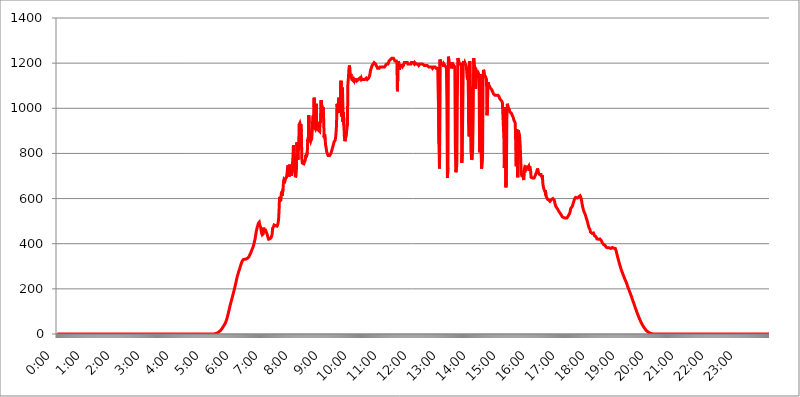
| Category | 2015.04.24. Intenzitás [W/m^2] |
|---|---|
| 0.0 | -0.256 |
| 0.0006944444444444445 | -0.256 |
| 0.001388888888888889 | -0.256 |
| 0.0020833333333333333 | -0.256 |
| 0.002777777777777778 | -0.256 |
| 0.003472222222222222 | -0.256 |
| 0.004166666666666667 | -0.256 |
| 0.004861111111111111 | -0.256 |
| 0.005555555555555556 | -0.256 |
| 0.0062499999999999995 | -0.256 |
| 0.006944444444444444 | -0.256 |
| 0.007638888888888889 | -0.256 |
| 0.008333333333333333 | -0.256 |
| 0.009027777777777779 | -0.256 |
| 0.009722222222222222 | -0.256 |
| 0.010416666666666666 | -0.256 |
| 0.011111111111111112 | -0.256 |
| 0.011805555555555555 | -0.256 |
| 0.012499999999999999 | -0.256 |
| 0.013194444444444444 | -0.256 |
| 0.013888888888888888 | -0.256 |
| 0.014583333333333332 | -0.256 |
| 0.015277777777777777 | -0.256 |
| 0.015972222222222224 | -0.256 |
| 0.016666666666666666 | -0.256 |
| 0.017361111111111112 | -0.256 |
| 0.018055555555555557 | -0.256 |
| 0.01875 | -0.256 |
| 0.019444444444444445 | -0.256 |
| 0.02013888888888889 | -0.256 |
| 0.020833333333333332 | -0.256 |
| 0.02152777777777778 | -0.256 |
| 0.022222222222222223 | -0.256 |
| 0.02291666666666667 | -0.256 |
| 0.02361111111111111 | -0.256 |
| 0.024305555555555556 | -0.256 |
| 0.024999999999999998 | -0.256 |
| 0.025694444444444447 | -0.256 |
| 0.02638888888888889 | -0.256 |
| 0.027083333333333334 | -0.256 |
| 0.027777777777777776 | -0.256 |
| 0.02847222222222222 | -0.256 |
| 0.029166666666666664 | -0.256 |
| 0.029861111111111113 | -0.256 |
| 0.030555555555555555 | -0.256 |
| 0.03125 | -0.256 |
| 0.03194444444444445 | -0.256 |
| 0.03263888888888889 | -0.256 |
| 0.03333333333333333 | -0.256 |
| 0.034027777777777775 | -0.256 |
| 0.034722222222222224 | -0.256 |
| 0.035416666666666666 | -0.256 |
| 0.036111111111111115 | -0.256 |
| 0.03680555555555556 | -0.256 |
| 0.0375 | -0.256 |
| 0.03819444444444444 | -0.256 |
| 0.03888888888888889 | -0.256 |
| 0.03958333333333333 | -0.256 |
| 0.04027777777777778 | -0.256 |
| 0.04097222222222222 | -0.256 |
| 0.041666666666666664 | -0.256 |
| 0.042361111111111106 | -0.256 |
| 0.04305555555555556 | -0.256 |
| 0.043750000000000004 | -0.256 |
| 0.044444444444444446 | -0.256 |
| 0.04513888888888889 | -0.256 |
| 0.04583333333333334 | -0.256 |
| 0.04652777777777778 | -0.256 |
| 0.04722222222222222 | -0.256 |
| 0.04791666666666666 | -0.256 |
| 0.04861111111111111 | -0.256 |
| 0.049305555555555554 | -0.256 |
| 0.049999999999999996 | -0.256 |
| 0.05069444444444445 | -0.256 |
| 0.051388888888888894 | -0.256 |
| 0.052083333333333336 | -0.256 |
| 0.05277777777777778 | -0.256 |
| 0.05347222222222222 | -0.256 |
| 0.05416666666666667 | -0.256 |
| 0.05486111111111111 | -0.256 |
| 0.05555555555555555 | -0.256 |
| 0.05625 | -0.256 |
| 0.05694444444444444 | -0.256 |
| 0.057638888888888885 | -0.256 |
| 0.05833333333333333 | -0.256 |
| 0.05902777777777778 | -0.256 |
| 0.059722222222222225 | -0.256 |
| 0.06041666666666667 | -0.256 |
| 0.061111111111111116 | -0.256 |
| 0.06180555555555556 | -0.256 |
| 0.0625 | -0.256 |
| 0.06319444444444444 | -0.256 |
| 0.06388888888888888 | -0.256 |
| 0.06458333333333334 | -0.256 |
| 0.06527777777777778 | -0.256 |
| 0.06597222222222222 | -0.256 |
| 0.06666666666666667 | -0.256 |
| 0.06736111111111111 | -0.256 |
| 0.06805555555555555 | -0.256 |
| 0.06874999999999999 | -0.256 |
| 0.06944444444444443 | -0.256 |
| 0.07013888888888889 | -0.256 |
| 0.07083333333333333 | -0.256 |
| 0.07152777777777779 | -0.256 |
| 0.07222222222222223 | -0.256 |
| 0.07291666666666667 | -0.256 |
| 0.07361111111111111 | -0.256 |
| 0.07430555555555556 | -0.256 |
| 0.075 | -0.256 |
| 0.07569444444444444 | -0.256 |
| 0.0763888888888889 | -0.256 |
| 0.07708333333333334 | -0.256 |
| 0.07777777777777778 | -0.256 |
| 0.07847222222222222 | -0.256 |
| 0.07916666666666666 | -0.256 |
| 0.0798611111111111 | -0.256 |
| 0.08055555555555556 | -0.256 |
| 0.08125 | -0.256 |
| 0.08194444444444444 | -0.256 |
| 0.08263888888888889 | -0.256 |
| 0.08333333333333333 | -0.256 |
| 0.08402777777777777 | -0.256 |
| 0.08472222222222221 | -0.256 |
| 0.08541666666666665 | -0.256 |
| 0.08611111111111112 | -0.256 |
| 0.08680555555555557 | -0.256 |
| 0.08750000000000001 | -0.256 |
| 0.08819444444444445 | -0.256 |
| 0.08888888888888889 | -0.256 |
| 0.08958333333333333 | -0.256 |
| 0.09027777777777778 | -0.256 |
| 0.09097222222222222 | -0.256 |
| 0.09166666666666667 | -0.256 |
| 0.09236111111111112 | -0.256 |
| 0.09305555555555556 | -0.256 |
| 0.09375 | -0.256 |
| 0.09444444444444444 | -0.256 |
| 0.09513888888888888 | -0.256 |
| 0.09583333333333333 | -0.256 |
| 0.09652777777777777 | -0.256 |
| 0.09722222222222222 | -0.256 |
| 0.09791666666666667 | -0.256 |
| 0.09861111111111111 | -0.256 |
| 0.09930555555555555 | -0.256 |
| 0.09999999999999999 | -0.256 |
| 0.10069444444444443 | -0.256 |
| 0.1013888888888889 | -0.256 |
| 0.10208333333333335 | -0.256 |
| 0.10277777777777779 | -0.256 |
| 0.10347222222222223 | -0.256 |
| 0.10416666666666667 | -0.256 |
| 0.10486111111111111 | -0.256 |
| 0.10555555555555556 | -0.256 |
| 0.10625 | -0.256 |
| 0.10694444444444444 | -0.256 |
| 0.1076388888888889 | -0.256 |
| 0.10833333333333334 | -0.256 |
| 0.10902777777777778 | -0.256 |
| 0.10972222222222222 | -0.256 |
| 0.1111111111111111 | -0.256 |
| 0.11180555555555556 | -0.256 |
| 0.11180555555555556 | -0.256 |
| 0.1125 | -0.256 |
| 0.11319444444444444 | -0.256 |
| 0.11388888888888889 | -0.256 |
| 0.11458333333333333 | -0.256 |
| 0.11527777777777777 | -0.256 |
| 0.11597222222222221 | -0.256 |
| 0.11666666666666665 | -0.256 |
| 0.1173611111111111 | -0.256 |
| 0.11805555555555557 | -0.256 |
| 0.11944444444444445 | -0.256 |
| 0.12013888888888889 | -0.256 |
| 0.12083333333333333 | -0.256 |
| 0.12152777777777778 | -0.256 |
| 0.12222222222222223 | -0.256 |
| 0.12291666666666667 | -0.256 |
| 0.12291666666666667 | -0.256 |
| 0.12361111111111112 | -0.256 |
| 0.12430555555555556 | -0.256 |
| 0.125 | -0.256 |
| 0.12569444444444444 | -0.256 |
| 0.12638888888888888 | -0.256 |
| 0.12708333333333333 | -0.256 |
| 0.16875 | -0.256 |
| 0.12847222222222224 | -0.256 |
| 0.12916666666666668 | -0.256 |
| 0.12986111111111112 | -0.256 |
| 0.13055555555555556 | -0.256 |
| 0.13125 | -0.256 |
| 0.13194444444444445 | -0.256 |
| 0.1326388888888889 | -0.256 |
| 0.13333333333333333 | -0.256 |
| 0.13402777777777777 | -0.256 |
| 0.13402777777777777 | -0.256 |
| 0.13472222222222222 | -0.256 |
| 0.13541666666666666 | -0.256 |
| 0.1361111111111111 | -0.256 |
| 0.13749999999999998 | -0.256 |
| 0.13819444444444443 | -0.256 |
| 0.1388888888888889 | -0.256 |
| 0.13958333333333334 | -0.256 |
| 0.14027777777777778 | -0.256 |
| 0.14097222222222222 | -0.256 |
| 0.14166666666666666 | -0.256 |
| 0.1423611111111111 | -0.256 |
| 0.14305555555555557 | -0.256 |
| 0.14375000000000002 | -0.256 |
| 0.14444444444444446 | -0.256 |
| 0.1451388888888889 | -0.256 |
| 0.1451388888888889 | -0.256 |
| 0.14652777777777778 | -0.256 |
| 0.14722222222222223 | -0.256 |
| 0.14791666666666667 | -0.256 |
| 0.1486111111111111 | -0.256 |
| 0.14930555555555555 | -0.256 |
| 0.15 | -0.256 |
| 0.15069444444444444 | -0.256 |
| 0.15138888888888888 | -0.256 |
| 0.15208333333333332 | -0.256 |
| 0.15277777777777776 | -0.256 |
| 0.15347222222222223 | -0.256 |
| 0.15416666666666667 | -0.256 |
| 0.15486111111111112 | -0.256 |
| 0.15555555555555556 | -0.256 |
| 0.15625 | -0.256 |
| 0.15694444444444444 | -0.256 |
| 0.15763888888888888 | -0.256 |
| 0.15833333333333333 | -0.256 |
| 0.15902777777777777 | -0.256 |
| 0.15972222222222224 | -0.256 |
| 0.16041666666666668 | -0.256 |
| 0.16111111111111112 | -0.256 |
| 0.16180555555555556 | -0.256 |
| 0.1625 | -0.256 |
| 0.16319444444444445 | -0.256 |
| 0.1638888888888889 | -0.256 |
| 0.16458333333333333 | -0.256 |
| 0.16527777777777777 | -0.256 |
| 0.16597222222222222 | -0.256 |
| 0.16666666666666666 | -0.256 |
| 0.1673611111111111 | -0.256 |
| 0.16805555555555554 | -0.256 |
| 0.16874999999999998 | -0.256 |
| 0.16944444444444443 | -0.256 |
| 0.17013888888888887 | -0.256 |
| 0.1708333333333333 | -0.256 |
| 0.17152777777777775 | -0.256 |
| 0.17222222222222225 | -0.256 |
| 0.1729166666666667 | -0.256 |
| 0.17361111111111113 | -0.256 |
| 0.17430555555555557 | -0.256 |
| 0.17500000000000002 | -0.256 |
| 0.17569444444444446 | -0.256 |
| 0.1763888888888889 | -0.256 |
| 0.17708333333333334 | -0.256 |
| 0.17777777777777778 | -0.256 |
| 0.17847222222222223 | -0.256 |
| 0.17916666666666667 | -0.256 |
| 0.1798611111111111 | -0.256 |
| 0.18055555555555555 | -0.256 |
| 0.18125 | -0.256 |
| 0.18194444444444444 | -0.256 |
| 0.1826388888888889 | -0.256 |
| 0.18333333333333335 | -0.256 |
| 0.1840277777777778 | -0.256 |
| 0.18472222222222223 | -0.256 |
| 0.18541666666666667 | -0.256 |
| 0.18611111111111112 | -0.256 |
| 0.18680555555555556 | -0.256 |
| 0.1875 | -0.256 |
| 0.18819444444444444 | -0.256 |
| 0.18888888888888888 | -0.256 |
| 0.18958333333333333 | -0.256 |
| 0.19027777777777777 | -0.256 |
| 0.1909722222222222 | -0.256 |
| 0.19166666666666665 | -0.256 |
| 0.19236111111111112 | -0.256 |
| 0.19305555555555554 | -0.256 |
| 0.19375 | -0.256 |
| 0.19444444444444445 | -0.256 |
| 0.1951388888888889 | -0.256 |
| 0.19583333333333333 | -0.256 |
| 0.19652777777777777 | -0.256 |
| 0.19722222222222222 | -0.256 |
| 0.19791666666666666 | -0.256 |
| 0.1986111111111111 | -0.256 |
| 0.19930555555555554 | -0.256 |
| 0.19999999999999998 | -0.256 |
| 0.20069444444444443 | -0.256 |
| 0.20138888888888887 | -0.256 |
| 0.2020833333333333 | -0.256 |
| 0.2027777777777778 | -0.256 |
| 0.2034722222222222 | -0.256 |
| 0.2041666666666667 | -0.256 |
| 0.20486111111111113 | -0.256 |
| 0.20555555555555557 | -0.256 |
| 0.20625000000000002 | -0.256 |
| 0.20694444444444446 | -0.256 |
| 0.2076388888888889 | -0.256 |
| 0.20833333333333334 | -0.256 |
| 0.20902777777777778 | -0.256 |
| 0.20972222222222223 | -0.256 |
| 0.21041666666666667 | -0.256 |
| 0.2111111111111111 | -0.256 |
| 0.21180555555555555 | -0.256 |
| 0.2125 | -0.256 |
| 0.21319444444444444 | -0.256 |
| 0.2138888888888889 | -0.256 |
| 0.21458333333333335 | -0.256 |
| 0.2152777777777778 | -0.256 |
| 0.21597222222222223 | -0.256 |
| 0.21666666666666667 | -0.256 |
| 0.21736111111111112 | -0.256 |
| 0.21805555555555556 | -0.256 |
| 0.21875 | -0.256 |
| 0.21944444444444444 | -0.256 |
| 0.22013888888888888 | -0.256 |
| 0.22083333333333333 | 1.09 |
| 0.22152777777777777 | 1.09 |
| 0.2222222222222222 | 1.09 |
| 0.22291666666666665 | 2.439 |
| 0.2236111111111111 | 2.439 |
| 0.22430555555555556 | 3.791 |
| 0.225 | 5.146 |
| 0.22569444444444445 | 7.862 |
| 0.2263888888888889 | 9.225 |
| 0.22708333333333333 | 10.589 |
| 0.22777777777777777 | 11.956 |
| 0.22847222222222222 | 13.325 |
| 0.22916666666666666 | 16.069 |
| 0.2298611111111111 | 18.822 |
| 0.23055555555555554 | 21.582 |
| 0.23124999999999998 | 24.35 |
| 0.23194444444444443 | 28.514 |
| 0.23263888888888887 | 31.297 |
| 0.2333333333333333 | 35.483 |
| 0.2340277777777778 | 38.28 |
| 0.2347222222222222 | 42.483 |
| 0.2354166666666667 | 45.29 |
| 0.23611111111111113 | 50.914 |
| 0.23680555555555557 | 56.548 |
| 0.23750000000000002 | 63.6 |
| 0.23819444444444446 | 70.658 |
| 0.2388888888888889 | 79.125 |
| 0.23958333333333334 | 87.583 |
| 0.24027777777777778 | 97.427 |
| 0.24097222222222223 | 105.834 |
| 0.24166666666666667 | 115.598 |
| 0.2423611111111111 | 125.304 |
| 0.24305555555555555 | 133.57 |
| 0.24375 | 141.782 |
| 0.24444444444444446 | 149.933 |
| 0.24513888888888888 | 158.022 |
| 0.24583333333333335 | 167.374 |
| 0.2465277777777778 | 175.315 |
| 0.24722222222222223 | 183.184 |
| 0.24791666666666667 | 192.271 |
| 0.24861111111111112 | 201.258 |
| 0.24930555555555556 | 210.144 |
| 0.25 | 220.177 |
| 0.25069444444444444 | 228.852 |
| 0.2513888888888889 | 239.868 |
| 0.2520833333333333 | 249.538 |
| 0.25277777777777777 | 257.913 |
| 0.2534722222222222 | 265.034 |
| 0.25416666666666665 | 273.281 |
| 0.2548611111111111 | 280.304 |
| 0.2555555555555556 | 286.13 |
| 0.25625000000000003 | 293.096 |
| 0.2569444444444445 | 301.198 |
| 0.2576388888888889 | 308.129 |
| 0.25833333333333336 | 313.904 |
| 0.2590277777777778 | 319.683 |
| 0.25972222222222224 | 324.314 |
| 0.2604166666666667 | 327.793 |
| 0.2611111111111111 | 330.117 |
| 0.26180555555555557 | 331.279 |
| 0.2625 | 331.279 |
| 0.26319444444444445 | 331.279 |
| 0.2638888888888889 | 331.279 |
| 0.26458333333333334 | 331.279 |
| 0.2652777777777778 | 332.443 |
| 0.2659722222222222 | 332.443 |
| 0.26666666666666666 | 334.774 |
| 0.2673611111111111 | 337.109 |
| 0.26805555555555555 | 339.449 |
| 0.26875 | 341.794 |
| 0.26944444444444443 | 345.322 |
| 0.2701388888888889 | 351.235 |
| 0.2708333333333333 | 354.805 |
| 0.27152777777777776 | 360.798 |
| 0.2722222222222222 | 366.851 |
| 0.27291666666666664 | 371.742 |
| 0.2736111111111111 | 377.925 |
| 0.2743055555555555 | 382.93 |
| 0.27499999999999997 | 389.27 |
| 0.27569444444444446 | 397.012 |
| 0.27638888888888885 | 406.25 |
| 0.27708333333333335 | 415.735 |
| 0.2777777777777778 | 426.916 |
| 0.27847222222222223 | 441.469 |
| 0.2791666666666667 | 455.184 |
| 0.2798611111111111 | 464.688 |
| 0.28055555555555556 | 474.507 |
| 0.28125 | 479.541 |
| 0.28194444444444444 | 489.873 |
| 0.2826388888888889 | 493.398 |
| 0.2833333333333333 | 495.176 |
| 0.28402777777777777 | 482.945 |
| 0.2847222222222222 | 482.945 |
| 0.28541666666666665 | 471.198 |
| 0.28611111111111115 | 453.629 |
| 0.28680555555555554 | 445.971 |
| 0.28750000000000003 | 439.982 |
| 0.2881944444444445 | 439.982 |
| 0.2888888888888889 | 444.463 |
| 0.28958333333333336 | 471.198 |
| 0.2902777777777778 | 455.184 |
| 0.29097222222222224 | 452.082 |
| 0.2916666666666667 | 455.184 |
| 0.2923611111111111 | 458.318 |
| 0.29305555555555557 | 458.318 |
| 0.29375 | 455.184 |
| 0.29444444444444445 | 441.469 |
| 0.2951388888888889 | 432.656 |
| 0.29583333333333334 | 425.497 |
| 0.2965277777777778 | 419.883 |
| 0.2972222222222222 | 419.883 |
| 0.29791666666666666 | 419.883 |
| 0.2986111111111111 | 422.678 |
| 0.29930555555555555 | 425.497 |
| 0.3 | 428.341 |
| 0.30069444444444443 | 434.107 |
| 0.3013888888888889 | 442.962 |
| 0.3020833333333333 | 467.925 |
| 0.30277777777777776 | 464.688 |
| 0.3034722222222222 | 476.176 |
| 0.30416666666666664 | 482.945 |
| 0.3048611111111111 | 484.662 |
| 0.3055555555555555 | 482.945 |
| 0.30624999999999997 | 479.541 |
| 0.3069444444444444 | 476.176 |
| 0.3076388888888889 | 476.176 |
| 0.30833333333333335 | 477.854 |
| 0.3090277777777778 | 482.945 |
| 0.30972222222222223 | 491.63 |
| 0.3104166666666667 | 507.927 |
| 0.3111111111111111 | 547.572 |
| 0.31180555555555556 | 607.495 |
| 0.3125 | 610.016 |
| 0.31319444444444444 | 587.934 |
| 0.3138888888888889 | 610.016 |
| 0.3145833333333333 | 630.814 |
| 0.31527777777777777 | 612.554 |
| 0.3159722222222222 | 612.554 |
| 0.31666666666666665 | 641.649 |
| 0.31736111111111115 | 676.003 |
| 0.31805555555555554 | 685.046 |
| 0.31875000000000003 | 688.102 |
| 0.3194444444444445 | 678.997 |
| 0.3201388888888889 | 688.102 |
| 0.32083333333333336 | 688.102 |
| 0.3215277777777778 | 694.278 |
| 0.32222222222222224 | 710.098 |
| 0.3229166666666667 | 729.817 |
| 0.3236111111111111 | 746.886 |
| 0.32430555555555557 | 743.425 |
| 0.325 | 697.399 |
| 0.32569444444444445 | 750.371 |
| 0.3263888888888889 | 739.988 |
| 0.32708333333333334 | 729.817 |
| 0.3277777777777778 | 743.425 |
| 0.3284722222222222 | 700.54 |
| 0.32916666666666666 | 739.988 |
| 0.3298611111111111 | 750.371 |
| 0.33055555555555555 | 782.842 |
| 0.33125 | 837.51 |
| 0.33194444444444443 | 833.43 |
| 0.3326388888888889 | 833.43 |
| 0.3333333333333333 | 713.328 |
| 0.3340277777777778 | 694.278 |
| 0.3347222222222222 | 700.54 |
| 0.3354166666666667 | 729.817 |
| 0.3361111111111111 | 849.92 |
| 0.3368055555555556 | 854.113 |
| 0.33749999999999997 | 771.794 |
| 0.33819444444444446 | 849.92 |
| 0.33888888888888885 | 817.382 |
| 0.33958333333333335 | 929.905 |
| 0.34027777777777773 | 934.639 |
| 0.34097222222222223 | 925.203 |
| 0.3416666666666666 | 929.905 |
| 0.3423611111111111 | 893.157 |
| 0.3430555555555555 | 775.451 |
| 0.34375 | 757.414 |
| 0.3444444444444445 | 757.414 |
| 0.3451388888888889 | 753.881 |
| 0.3458333333333334 | 753.881 |
| 0.34652777777777777 | 753.881 |
| 0.34722222222222227 | 757.414 |
| 0.34791666666666665 | 771.794 |
| 0.34861111111111115 | 794.119 |
| 0.34930555555555554 | 782.842 |
| 0.35000000000000003 | 786.575 |
| 0.3506944444444444 | 805.632 |
| 0.3513888888888889 | 862.585 |
| 0.3520833333333333 | 849.92 |
| 0.3527777777777778 | 968.671 |
| 0.3534722222222222 | 875.511 |
| 0.3541666666666667 | 871.173 |
| 0.3548611111111111 | 862.585 |
| 0.35555555555555557 | 854.113 |
| 0.35625 | 854.113 |
| 0.35694444444444445 | 866.865 |
| 0.3576388888888889 | 902.16 |
| 0.35833333333333334 | 953.892 |
| 0.3590277777777778 | 968.671 |
| 0.3597222222222222 | 906.707 |
| 0.36041666666666666 | 1047.117 |
| 0.3611111111111111 | 915.893 |
| 0.36180555555555555 | 911.285 |
| 0.3625 | 925.203 |
| 0.36319444444444443 | 1020.106 |
| 0.3638888888888889 | 902.16 |
| 0.3645833333333333 | 902.16 |
| 0.3652777777777778 | 915.893 |
| 0.3659722222222222 | 939.404 |
| 0.3666666666666667 | 902.16 |
| 0.3673611111111111 | 902.16 |
| 0.3680555555555556 | 897.643 |
| 0.36874999999999997 | 944.201 |
| 0.36944444444444446 | 934.639 |
| 0.37013888888888885 | 1036.206 |
| 0.37083333333333335 | 1014.809 |
| 0.37152777777777773 | 1009.546 |
| 0.37222222222222223 | 988.839 |
| 0.3729166666666666 | 1004.318 |
| 0.3736111111111111 | 953.892 |
| 0.3743055555555555 | 871.173 |
| 0.375 | 884.274 |
| 0.3756944444444445 | 862.585 |
| 0.3763888888888889 | 837.51 |
| 0.3770833333333334 | 825.351 |
| 0.37777777777777777 | 809.522 |
| 0.37847222222222227 | 801.768 |
| 0.37916666666666665 | 801.768 |
| 0.37986111111111115 | 790.334 |
| 0.38055555555555554 | 786.575 |
| 0.38125000000000003 | 786.575 |
| 0.3819444444444444 | 790.334 |
| 0.3826388888888889 | 794.119 |
| 0.3833333333333333 | 794.119 |
| 0.3840277777777778 | 801.768 |
| 0.3847222222222222 | 809.522 |
| 0.3854166666666667 | 813.439 |
| 0.3861111111111111 | 825.351 |
| 0.38680555555555557 | 833.43 |
| 0.3875 | 833.43 |
| 0.38819444444444445 | 849.92 |
| 0.3888888888888889 | 854.113 |
| 0.38958333333333334 | 858.335 |
| 0.3902777777777778 | 866.865 |
| 0.3909722222222222 | 888.701 |
| 0.39166666666666666 | 925.203 |
| 0.3923611111111111 | 1020.106 |
| 0.39305555555555555 | 1020.106 |
| 0.39375 | 983.747 |
| 0.39444444444444443 | 983.747 |
| 0.3951388888888889 | 1047.117 |
| 0.3958333333333333 | 978.688 |
| 0.3965277777777778 | 1014.809 |
| 0.3972222222222222 | 993.965 |
| 0.3979166666666667 | 1121.587 |
| 0.3986111111111111 | 963.712 |
| 0.3993055555555556 | 968.671 |
| 0.39999999999999997 | 1092.203 |
| 0.40069444444444446 | 939.404 |
| 0.40138888888888885 | 983.747 |
| 0.40208333333333335 | 920.533 |
| 0.40277777777777773 | 871.173 |
| 0.40347222222222223 | 854.113 |
| 0.4041666666666666 | 849.92 |
| 0.4048611111111111 | 858.335 |
| 0.4055555555555555 | 888.701 |
| 0.40625 | 911.285 |
| 0.4069444444444445 | 925.203 |
| 0.4076388888888889 | 1109.72 |
| 0.4083333333333334 | 1133.607 |
| 0.40902777777777777 | 1170.601 |
| 0.40972222222222227 | 1189.633 |
| 0.41041666666666665 | 1170.601 |
| 0.41111111111111115 | 1145.782 |
| 0.41180555555555554 | 1151.928 |
| 0.41250000000000003 | 1139.675 |
| 0.4131944444444444 | 1127.578 |
| 0.4138888888888889 | 1127.578 |
| 0.4145833333333333 | 1127.578 |
| 0.4152777777777778 | 1121.587 |
| 0.4159722222222222 | 1127.578 |
| 0.4166666666666667 | 1121.587 |
| 0.4173611111111111 | 1127.578 |
| 0.41805555555555557 | 1127.578 |
| 0.41875 | 1127.578 |
| 0.41944444444444445 | 1127.578 |
| 0.4201388888888889 | 1121.587 |
| 0.42083333333333334 | 1121.587 |
| 0.4215277777777778 | 1121.587 |
| 0.4222222222222222 | 1127.578 |
| 0.42291666666666666 | 1127.578 |
| 0.4236111111111111 | 1127.578 |
| 0.42430555555555555 | 1133.607 |
| 0.425 | 1133.607 |
| 0.42569444444444443 | 1127.578 |
| 0.4263888888888889 | 1133.607 |
| 0.4270833333333333 | 1127.578 |
| 0.4277777777777778 | 1127.578 |
| 0.4284722222222222 | 1127.578 |
| 0.4291666666666667 | 1127.578 |
| 0.4298611111111111 | 1127.578 |
| 0.4305555555555556 | 1127.578 |
| 0.43124999999999997 | 1127.578 |
| 0.43194444444444446 | 1127.578 |
| 0.43263888888888885 | 1127.578 |
| 0.43333333333333335 | 1133.607 |
| 0.43402777777777773 | 1133.607 |
| 0.43472222222222223 | 1127.578 |
| 0.4354166666666666 | 1127.578 |
| 0.4361111111111111 | 1127.578 |
| 0.4368055555555555 | 1133.607 |
| 0.4375 | 1139.675 |
| 0.4381944444444445 | 1145.782 |
| 0.4388888888888889 | 1158.113 |
| 0.4395833333333334 | 1170.601 |
| 0.44027777777777777 | 1176.905 |
| 0.44097222222222227 | 1176.905 |
| 0.44166666666666665 | 1189.633 |
| 0.44236111111111115 | 1189.633 |
| 0.44305555555555554 | 1196.058 |
| 0.44375000000000003 | 1196.058 |
| 0.4444444444444444 | 1202.523 |
| 0.4451388888888889 | 1202.523 |
| 0.4458333333333333 | 1202.523 |
| 0.4465277777777778 | 1196.058 |
| 0.4472222222222222 | 1189.633 |
| 0.4479166666666667 | 1189.633 |
| 0.4486111111111111 | 1183.249 |
| 0.44930555555555557 | 1176.905 |
| 0.45 | 1176.905 |
| 0.45069444444444445 | 1176.905 |
| 0.4513888888888889 | 1176.905 |
| 0.45208333333333334 | 1176.905 |
| 0.4527777777777778 | 1183.249 |
| 0.4534722222222222 | 1183.249 |
| 0.45416666666666666 | 1183.249 |
| 0.4548611111111111 | 1183.249 |
| 0.45555555555555555 | 1183.249 |
| 0.45625 | 1183.249 |
| 0.45694444444444443 | 1183.249 |
| 0.4576388888888889 | 1183.249 |
| 0.4583333333333333 | 1183.249 |
| 0.4590277777777778 | 1183.249 |
| 0.4597222222222222 | 1183.249 |
| 0.4604166666666667 | 1189.633 |
| 0.4611111111111111 | 1189.633 |
| 0.4618055555555556 | 1196.058 |
| 0.46249999999999997 | 1196.058 |
| 0.46319444444444446 | 1196.058 |
| 0.46388888888888885 | 1196.058 |
| 0.46458333333333335 | 1202.523 |
| 0.46527777777777773 | 1209.029 |
| 0.46597222222222223 | 1209.029 |
| 0.4666666666666666 | 1209.029 |
| 0.4673611111111111 | 1215.576 |
| 0.4680555555555555 | 1215.576 |
| 0.46875 | 1215.576 |
| 0.4694444444444445 | 1222.164 |
| 0.4701388888888889 | 1222.164 |
| 0.4708333333333334 | 1222.164 |
| 0.47152777777777777 | 1222.164 |
| 0.47222222222222227 | 1222.164 |
| 0.47291666666666665 | 1222.164 |
| 0.47361111111111115 | 1209.029 |
| 0.47430555555555554 | 1209.029 |
| 0.47500000000000003 | 1209.029 |
| 0.4756944444444444 | 1209.029 |
| 0.4763888888888889 | 1202.523 |
| 0.4770833333333333 | 1075.021 |
| 0.4777777777777778 | 1176.905 |
| 0.4784722222222222 | 1209.029 |
| 0.4791666666666667 | 1196.058 |
| 0.4798611111111111 | 1170.601 |
| 0.48055555555555557 | 1189.633 |
| 0.48125 | 1189.633 |
| 0.48194444444444445 | 1189.633 |
| 0.4826388888888889 | 1189.633 |
| 0.48333333333333334 | 1189.633 |
| 0.4840277777777778 | 1183.249 |
| 0.4847222222222222 | 1183.249 |
| 0.48541666666666666 | 1189.633 |
| 0.4861111111111111 | 1196.058 |
| 0.48680555555555555 | 1202.523 |
| 0.4875 | 1202.523 |
| 0.48819444444444443 | 1202.523 |
| 0.4888888888888889 | 1202.523 |
| 0.4895833333333333 | 1202.523 |
| 0.4902777777777778 | 1202.523 |
| 0.4909722222222222 | 1202.523 |
| 0.4916666666666667 | 1196.058 |
| 0.4923611111111111 | 1196.058 |
| 0.4930555555555556 | 1196.058 |
| 0.49374999999999997 | 1196.058 |
| 0.49444444444444446 | 1196.058 |
| 0.49513888888888885 | 1196.058 |
| 0.49583333333333335 | 1196.058 |
| 0.49652777777777773 | 1202.523 |
| 0.49722222222222223 | 1202.523 |
| 0.4979166666666666 | 1202.523 |
| 0.4986111111111111 | 1202.523 |
| 0.4993055555555555 | 1202.523 |
| 0.5 | 1202.523 |
| 0.5006944444444444 | 1196.058 |
| 0.5013888888888889 | 1202.523 |
| 0.5020833333333333 | 1202.523 |
| 0.5027777777777778 | 1202.523 |
| 0.5034722222222222 | 1196.058 |
| 0.5041666666666667 | 1196.058 |
| 0.5048611111111111 | 1196.058 |
| 0.5055555555555555 | 1196.058 |
| 0.50625 | 1196.058 |
| 0.5069444444444444 | 1189.633 |
| 0.5076388888888889 | 1189.633 |
| 0.5083333333333333 | 1196.058 |
| 0.5090277777777777 | 1196.058 |
| 0.5097222222222222 | 1196.058 |
| 0.5104166666666666 | 1196.058 |
| 0.5111111111111112 | 1196.058 |
| 0.5118055555555555 | 1196.058 |
| 0.5125000000000001 | 1196.058 |
| 0.5131944444444444 | 1196.058 |
| 0.513888888888889 | 1196.058 |
| 0.5145833333333333 | 1189.633 |
| 0.5152777777777778 | 1189.633 |
| 0.5159722222222222 | 1189.633 |
| 0.5166666666666667 | 1189.633 |
| 0.517361111111111 | 1189.633 |
| 0.5180555555555556 | 1189.633 |
| 0.5187499999999999 | 1189.633 |
| 0.5194444444444445 | 1189.633 |
| 0.5201388888888888 | 1189.633 |
| 0.5208333333333334 | 1183.249 |
| 0.5215277777777778 | 1183.249 |
| 0.5222222222222223 | 1183.249 |
| 0.5229166666666667 | 1183.249 |
| 0.5236111111111111 | 1183.249 |
| 0.5243055555555556 | 1183.249 |
| 0.525 | 1183.249 |
| 0.5256944444444445 | 1183.249 |
| 0.5263888888888889 | 1176.905 |
| 0.5270833333333333 | 1176.905 |
| 0.5277777777777778 | 1183.249 |
| 0.5284722222222222 | 1183.249 |
| 0.5291666666666667 | 1183.249 |
| 0.5298611111111111 | 1183.249 |
| 0.5305555555555556 | 1183.249 |
| 0.53125 | 1176.905 |
| 0.5319444444444444 | 1176.905 |
| 0.5326388888888889 | 1176.905 |
| 0.5333333333333333 | 1176.905 |
| 0.5340277777777778 | 1183.249 |
| 0.5347222222222222 | 1183.249 |
| 0.5354166666666667 | 841.619 |
| 0.5361111111111111 | 733.184 |
| 0.5368055555555555 | 1215.576 |
| 0.5375 | 1215.576 |
| 0.5381944444444444 | 1202.523 |
| 0.5388888888888889 | 1196.058 |
| 0.5395833333333333 | 1196.058 |
| 0.5402777777777777 | 1196.058 |
| 0.5409722222222222 | 1196.058 |
| 0.5416666666666666 | 1183.249 |
| 0.5423611111111112 | 1196.058 |
| 0.5430555555555555 | 1196.058 |
| 0.5437500000000001 | 1189.633 |
| 0.5444444444444444 | 1189.633 |
| 0.545138888888889 | 1183.249 |
| 0.5458333333333333 | 1176.905 |
| 0.5465277777777778 | 1025.437 |
| 0.5472222222222222 | 691.18 |
| 0.5479166666666667 | 736.574 |
| 0.548611111111111 | 1228.794 |
| 0.5493055555555556 | 1209.029 |
| 0.5499999999999999 | 1202.523 |
| 0.5506944444444445 | 1202.523 |
| 0.5513888888888888 | 1196.058 |
| 0.5520833333333334 | 1196.058 |
| 0.5527777777777778 | 1176.905 |
| 0.5534722222222223 | 1202.523 |
| 0.5541666666666667 | 1196.058 |
| 0.5548611111111111 | 1196.058 |
| 0.5555555555555556 | 1176.905 |
| 0.55625 | 1189.633 |
| 0.5569444444444445 | 1189.633 |
| 0.5576388888888889 | 1183.249 |
| 0.5583333333333333 | 837.51 |
| 0.5590277777777778 | 716.58 |
| 0.5597222222222222 | 729.817 |
| 0.5604166666666667 | 750.371 |
| 0.5611111111111111 | 1047.117 |
| 0.5618055555555556 | 1222.164 |
| 0.5625 | 1215.576 |
| 0.5631944444444444 | 1209.029 |
| 0.5638888888888889 | 1196.058 |
| 0.5645833333333333 | 1196.058 |
| 0.5652777777777778 | 1196.058 |
| 0.5659722222222222 | 1196.058 |
| 0.5666666666666667 | 1189.633 |
| 0.5673611111111111 | 757.414 |
| 0.5680555555555555 | 801.768 |
| 0.56875 | 999.125 |
| 0.5694444444444444 | 1202.523 |
| 0.5701388888888889 | 1209.029 |
| 0.5708333333333333 | 1196.058 |
| 0.5715277777777777 | 1202.523 |
| 0.5722222222222222 | 1196.058 |
| 0.5729166666666666 | 1196.058 |
| 0.5736111111111112 | 1189.633 |
| 0.5743055555555555 | 1189.633 |
| 0.5750000000000001 | 1133.607 |
| 0.5756944444444444 | 1127.578 |
| 0.576388888888889 | 1183.249 |
| 0.5770833333333333 | 929.905 |
| 0.5777777777777778 | 875.511 |
| 0.5784722222222222 | 1209.029 |
| 0.5791666666666667 | 1075.021 |
| 0.579861111111111 | 1092.203 |
| 0.5805555555555556 | 805.632 |
| 0.5812499999999999 | 771.794 |
| 0.5819444444444445 | 779.134 |
| 0.5826388888888888 | 821.353 |
| 0.5833333333333334 | 968.671 |
| 0.5840277777777778 | 1222.164 |
| 0.5847222222222223 | 1196.058 |
| 0.5854166666666667 | 1183.249 |
| 0.5861111111111111 | 1176.905 |
| 0.5868055555555556 | 1086.439 |
| 0.5875 | 1158.113 |
| 0.5881944444444445 | 1164.337 |
| 0.5888888888888889 | 1158.113 |
| 0.5895833333333333 | 1151.928 |
| 0.5902777777777778 | 1145.782 |
| 0.5909722222222222 | 1151.928 |
| 0.5916666666666667 | 1145.782 |
| 0.5923611111111111 | 805.632 |
| 0.5930555555555556 | 1151.928 |
| 0.59375 | 858.335 |
| 0.5944444444444444 | 866.865 |
| 0.5951388888888889 | 733.184 |
| 0.5958333333333333 | 736.574 |
| 0.5965277777777778 | 794.119 |
| 0.5972222222222222 | 1139.675 |
| 0.5979166666666667 | 1170.601 |
| 0.5986111111111111 | 1164.337 |
| 0.5993055555555555 | 1145.782 |
| 0.6 | 1145.782 |
| 0.6006944444444444 | 1139.675 |
| 0.6013888888888889 | 1133.607 |
| 0.6020833333333333 | 1127.578 |
| 0.6027777777777777 | 968.671 |
| 0.6034722222222222 | 1030.804 |
| 0.6041666666666666 | 1115.634 |
| 0.6048611111111112 | 1103.843 |
| 0.6055555555555555 | 1103.843 |
| 0.6062500000000001 | 1098.004 |
| 0.6069444444444444 | 1092.203 |
| 0.607638888888889 | 1092.203 |
| 0.6083333333333333 | 1086.439 |
| 0.6090277777777778 | 1086.439 |
| 0.6097222222222222 | 1080.711 |
| 0.6104166666666667 | 1075.021 |
| 0.611111111111111 | 1069.368 |
| 0.6118055555555556 | 1063.751 |
| 0.6124999999999999 | 1063.751 |
| 0.6131944444444445 | 1063.751 |
| 0.6138888888888888 | 1058.17 |
| 0.6145833333333334 | 1058.17 |
| 0.6152777777777778 | 1058.17 |
| 0.6159722222222223 | 1058.17 |
| 0.6166666666666667 | 1058.17 |
| 0.6173611111111111 | 1058.17 |
| 0.6180555555555556 | 1058.17 |
| 0.61875 | 1058.17 |
| 0.6194444444444445 | 1052.625 |
| 0.6201388888888889 | 1047.117 |
| 0.6208333333333333 | 1041.644 |
| 0.6215277777777778 | 1041.644 |
| 0.6222222222222222 | 1036.206 |
| 0.6229166666666667 | 1036.206 |
| 0.6236111111111111 | 1030.804 |
| 0.6243055555555556 | 1025.437 |
| 0.625 | 1025.437 |
| 0.6256944444444444 | 1025.437 |
| 0.6263888888888889 | 871.173 |
| 0.6270833333333333 | 736.574 |
| 0.6277777777777778 | 849.92 |
| 0.6284722222222222 | 1004.318 |
| 0.6291666666666667 | 649.973 |
| 0.6298611111111111 | 676.003 |
| 0.6305555555555555 | 953.892 |
| 0.63125 | 1020.106 |
| 0.6319444444444444 | 1009.546 |
| 0.6326388888888889 | 1004.318 |
| 0.6333333333333333 | 999.125 |
| 0.6340277777777777 | 993.965 |
| 0.6347222222222222 | 983.747 |
| 0.6354166666666666 | 983.747 |
| 0.6361111111111112 | 983.747 |
| 0.6368055555555555 | 978.688 |
| 0.6375000000000001 | 973.663 |
| 0.6381944444444444 | 968.671 |
| 0.638888888888889 | 963.712 |
| 0.6395833333333333 | 958.785 |
| 0.6402777777777778 | 949.03 |
| 0.6409722222222222 | 944.201 |
| 0.6416666666666667 | 939.404 |
| 0.642361111111111 | 934.639 |
| 0.6430555555555556 | 934.639 |
| 0.6437499999999999 | 743.425 |
| 0.6444444444444445 | 906.707 |
| 0.6451388888888888 | 906.707 |
| 0.6458333333333334 | 694.278 |
| 0.6465277777777778 | 902.16 |
| 0.6472222222222223 | 893.157 |
| 0.6479166666666667 | 888.701 |
| 0.6486111111111111 | 871.173 |
| 0.6493055555555556 | 833.43 |
| 0.65 | 775.451 |
| 0.6506944444444445 | 716.58 |
| 0.6513888888888889 | 703.704 |
| 0.6520833333333333 | 697.399 |
| 0.6527777777777778 | 713.328 |
| 0.6534722222222222 | 716.58 |
| 0.6541666666666667 | 682.011 |
| 0.6548611111111111 | 726.474 |
| 0.6555555555555556 | 736.574 |
| 0.65625 | 736.574 |
| 0.6569444444444444 | 729.817 |
| 0.6576388888888889 | 739.988 |
| 0.6583333333333333 | 739.988 |
| 0.6590277777777778 | 739.988 |
| 0.6597222222222222 | 736.574 |
| 0.6604166666666667 | 736.574 |
| 0.6611111111111111 | 743.425 |
| 0.6618055555555555 | 723.153 |
| 0.6625 | 743.425 |
| 0.6631944444444444 | 736.574 |
| 0.6638888888888889 | 723.153 |
| 0.6645833333333333 | 694.278 |
| 0.6652777777777777 | 694.278 |
| 0.6659722222222222 | 691.18 |
| 0.6666666666666666 | 691.18 |
| 0.6673611111111111 | 691.18 |
| 0.6680555555555556 | 691.18 |
| 0.6687500000000001 | 691.18 |
| 0.6694444444444444 | 694.278 |
| 0.6701388888888888 | 700.54 |
| 0.6708333333333334 | 697.399 |
| 0.6715277777777778 | 703.704 |
| 0.6722222222222222 | 716.58 |
| 0.6729166666666666 | 716.58 |
| 0.6736111111111112 | 733.184 |
| 0.6743055555555556 | 723.153 |
| 0.6749999999999999 | 713.328 |
| 0.6756944444444444 | 710.098 |
| 0.6763888888888889 | 706.89 |
| 0.6770833333333334 | 710.098 |
| 0.6777777777777777 | 710.098 |
| 0.6784722222222223 | 706.89 |
| 0.6791666666666667 | 694.278 |
| 0.6798611111111111 | 703.704 |
| 0.6805555555555555 | 691.18 |
| 0.68125 | 661.343 |
| 0.6819444444444445 | 649.973 |
| 0.6826388888888889 | 641.649 |
| 0.6833333333333332 | 636.194 |
| 0.6840277777777778 | 630.814 |
| 0.6847222222222222 | 636.194 |
| 0.6854166666666667 | 612.554 |
| 0.686111111111111 | 607.495 |
| 0.6868055555555556 | 602.505 |
| 0.6875 | 597.582 |
| 0.6881944444444444 | 600.035 |
| 0.688888888888889 | 595.145 |
| 0.6895833333333333 | 592.725 |
| 0.6902777777777778 | 590.321 |
| 0.6909722222222222 | 587.934 |
| 0.6916666666666668 | 587.934 |
| 0.6923611111111111 | 590.321 |
| 0.6930555555555555 | 595.145 |
| 0.69375 | 595.145 |
| 0.6944444444444445 | 597.582 |
| 0.6951388888888889 | 600.035 |
| 0.6958333333333333 | 597.582 |
| 0.6965277777777777 | 597.582 |
| 0.6972222222222223 | 592.725 |
| 0.6979166666666666 | 580.866 |
| 0.6986111111111111 | 571.661 |
| 0.6993055555555556 | 564.917 |
| 0.7000000000000001 | 560.495 |
| 0.7006944444444444 | 558.305 |
| 0.7013888888888888 | 556.131 |
| 0.7020833333333334 | 551.823 |
| 0.7027777777777778 | 547.572 |
| 0.7034722222222222 | 543.376 |
| 0.7041666666666666 | 539.234 |
| 0.7048611111111112 | 537.182 |
| 0.7055555555555556 | 535.145 |
| 0.7062499999999999 | 533.12 |
| 0.7069444444444444 | 527.122 |
| 0.7076388888888889 | 523.186 |
| 0.7083333333333334 | 519.3 |
| 0.7090277777777777 | 515.462 |
| 0.7097222222222223 | 515.462 |
| 0.7104166666666667 | 515.462 |
| 0.7111111111111111 | 515.462 |
| 0.7118055555555555 | 515.462 |
| 0.7125 | 513.561 |
| 0.7131944444444445 | 511.671 |
| 0.7138888888888889 | 511.671 |
| 0.7145833333333332 | 513.561 |
| 0.7152777777777778 | 515.462 |
| 0.7159722222222222 | 519.3 |
| 0.7166666666666667 | 523.186 |
| 0.717361111111111 | 527.122 |
| 0.7180555555555556 | 531.108 |
| 0.71875 | 535.145 |
| 0.7194444444444444 | 543.376 |
| 0.720138888888889 | 556.131 |
| 0.7208333333333333 | 558.305 |
| 0.7215277777777778 | 560.495 |
| 0.7222222222222222 | 564.917 |
| 0.7229166666666668 | 571.661 |
| 0.7236111111111111 | 578.542 |
| 0.7243055555555555 | 585.562 |
| 0.725 | 592.725 |
| 0.7256944444444445 | 600.035 |
| 0.7263888888888889 | 600.035 |
| 0.7270833333333333 | 604.992 |
| 0.7277777777777777 | 607.495 |
| 0.7284722222222223 | 604.992 |
| 0.7291666666666666 | 602.505 |
| 0.7298611111111111 | 602.505 |
| 0.7305555555555556 | 604.992 |
| 0.7312500000000001 | 607.495 |
| 0.7319444444444444 | 610.016 |
| 0.7326388888888888 | 610.016 |
| 0.7333333333333334 | 612.554 |
| 0.7340277777777778 | 612.554 |
| 0.7347222222222222 | 602.505 |
| 0.7354166666666666 | 590.321 |
| 0.7361111111111112 | 576.233 |
| 0.7368055555555556 | 564.917 |
| 0.7374999999999999 | 556.131 |
| 0.7381944444444444 | 547.572 |
| 0.7388888888888889 | 541.298 |
| 0.7395833333333334 | 537.182 |
| 0.7402777777777777 | 531.108 |
| 0.7409722222222223 | 525.148 |
| 0.7416666666666667 | 517.375 |
| 0.7423611111111111 | 509.793 |
| 0.7430555555555555 | 504.229 |
| 0.74375 | 495.176 |
| 0.7444444444444445 | 486.389 |
| 0.7451388888888889 | 477.854 |
| 0.7458333333333332 | 471.198 |
| 0.7465277777777778 | 466.302 |
| 0.7472222222222222 | 461.486 |
| 0.7479166666666667 | 452.082 |
| 0.748611111111111 | 449.011 |
| 0.7493055555555556 | 449.011 |
| 0.75 | 445.971 |
| 0.7506944444444444 | 447.487 |
| 0.751388888888889 | 447.487 |
| 0.7520833333333333 | 447.487 |
| 0.7527777777777778 | 445.971 |
| 0.7534722222222222 | 435.566 |
| 0.7541666666666668 | 434.107 |
| 0.7548611111111111 | 434.107 |
| 0.7555555555555555 | 431.211 |
| 0.75625 | 426.916 |
| 0.7569444444444445 | 421.278 |
| 0.7576388888888889 | 419.883 |
| 0.7583333333333333 | 419.883 |
| 0.7590277777777777 | 419.883 |
| 0.7597222222222223 | 419.883 |
| 0.7604166666666666 | 421.278 |
| 0.7611111111111111 | 421.278 |
| 0.7618055555555556 | 419.883 |
| 0.7625000000000001 | 417.112 |
| 0.7631944444444444 | 412.998 |
| 0.7638888888888888 | 408.934 |
| 0.7645833333333334 | 403.587 |
| 0.7652777777777778 | 400.943 |
| 0.7659722222222222 | 397.012 |
| 0.7666666666666666 | 394.415 |
| 0.7673611111111112 | 393.122 |
| 0.7680555555555556 | 393.122 |
| 0.7687499999999999 | 391.834 |
| 0.7694444444444444 | 389.27 |
| 0.7701388888888889 | 384.191 |
| 0.7708333333333334 | 382.93 |
| 0.7715277777777777 | 384.191 |
| 0.7722222222222223 | 381.674 |
| 0.7729166666666667 | 380.42 |
| 0.7736111111111111 | 381.674 |
| 0.7743055555555555 | 381.674 |
| 0.775 | 379.171 |
| 0.7756944444444445 | 380.42 |
| 0.7763888888888889 | 379.171 |
| 0.7770833333333332 | 379.171 |
| 0.7777777777777778 | 381.674 |
| 0.7784722222222222 | 382.93 |
| 0.7791666666666667 | 382.93 |
| 0.779861111111111 | 381.674 |
| 0.7805555555555556 | 380.42 |
| 0.78125 | 380.42 |
| 0.7819444444444444 | 381.674 |
| 0.782638888888889 | 379.171 |
| 0.7833333333333333 | 375.442 |
| 0.7840277777777778 | 366.851 |
| 0.7847222222222222 | 357.196 |
| 0.7854166666666668 | 347.682 |
| 0.7861111111111111 | 339.449 |
| 0.7868055555555555 | 331.279 |
| 0.7875 | 323.156 |
| 0.7881944444444445 | 315.059 |
| 0.7888888888888889 | 306.974 |
| 0.7895833333333333 | 300.041 |
| 0.7902777777777777 | 293.096 |
| 0.7909722222222223 | 284.967 |
| 0.7916666666666666 | 279.136 |
| 0.7923611111111111 | 273.281 |
| 0.7930555555555556 | 268.576 |
| 0.7937500000000001 | 261.48 |
| 0.7944444444444444 | 256.722 |
| 0.7951388888888888 | 250.739 |
| 0.7958333333333334 | 244.717 |
| 0.7965277777777778 | 239.868 |
| 0.7972222222222222 | 234.99 |
| 0.7979166666666666 | 230.083 |
| 0.7986111111111112 | 223.906 |
| 0.7993055555555556 | 217.681 |
| 0.7999999999999999 | 210.144 |
| 0.8006944444444444 | 205.079 |
| 0.8013888888888889 | 198.701 |
| 0.8020833333333334 | 193.561 |
| 0.8027777777777777 | 187.091 |
| 0.8034722222222223 | 183.184 |
| 0.8041666666666667 | 176.631 |
| 0.8048611111111111 | 170.029 |
| 0.8055555555555555 | 164.712 |
| 0.80625 | 156.678 |
| 0.8069444444444445 | 151.286 |
| 0.8076388888888889 | 144.506 |
| 0.8083333333333332 | 139.051 |
| 0.8090277777777778 | 132.196 |
| 0.8097222222222222 | 125.304 |
| 0.8104166666666667 | 119.766 |
| 0.811111111111111 | 112.814 |
| 0.8118055555555556 | 107.232 |
| 0.8125 | 100.233 |
| 0.8131944444444444 | 94.617 |
| 0.813888888888889 | 88.991 |
| 0.8145833333333333 | 83.356 |
| 0.8152777777777778 | 77.715 |
| 0.8159722222222222 | 72.069 |
| 0.8166666666666668 | 67.835 |
| 0.8173611111111111 | 62.189 |
| 0.8180555555555555 | 56.548 |
| 0.81875 | 52.322 |
| 0.8194444444444445 | 48.1 |
| 0.8201388888888889 | 43.886 |
| 0.8208333333333333 | 39.68 |
| 0.8215277777777777 | 35.483 |
| 0.8222222222222223 | 32.691 |
| 0.8229166666666666 | 28.514 |
| 0.8236111111111111 | 25.736 |
| 0.8243055555555556 | 22.965 |
| 0.8250000000000001 | 20.201 |
| 0.8256944444444444 | 17.444 |
| 0.8263888888888888 | 14.696 |
| 0.8270833333333334 | 13.325 |
| 0.8277777777777778 | 11.956 |
| 0.8284722222222222 | 9.225 |
| 0.8291666666666666 | 7.862 |
| 0.8298611111111112 | 6.503 |
| 0.8305555555555556 | 5.146 |
| 0.8312499999999999 | 5.146 |
| 0.8319444444444444 | 3.791 |
| 0.8326388888888889 | 2.439 |
| 0.8333333333333334 | 2.439 |
| 0.8340277777777777 | 1.09 |
| 0.8347222222222223 | 1.09 |
| 0.8354166666666667 | 1.09 |
| 0.8361111111111111 | -0.256 |
| 0.8368055555555555 | -0.256 |
| 0.8375 | -0.256 |
| 0.8381944444444445 | -0.256 |
| 0.8388888888888889 | -0.256 |
| 0.8395833333333332 | -0.256 |
| 0.8402777777777778 | -0.256 |
| 0.8409722222222222 | -0.256 |
| 0.8416666666666667 | -0.256 |
| 0.842361111111111 | -0.256 |
| 0.8430555555555556 | -0.256 |
| 0.84375 | -0.256 |
| 0.8444444444444444 | -0.256 |
| 0.845138888888889 | -0.256 |
| 0.8458333333333333 | -0.256 |
| 0.8465277777777778 | -0.256 |
| 0.8472222222222222 | -0.256 |
| 0.8479166666666668 | -0.256 |
| 0.8486111111111111 | -0.256 |
| 0.8493055555555555 | -0.256 |
| 0.85 | -0.256 |
| 0.8506944444444445 | -0.256 |
| 0.8513888888888889 | -0.256 |
| 0.8520833333333333 | -0.256 |
| 0.8527777777777777 | -0.256 |
| 0.8534722222222223 | -0.256 |
| 0.8541666666666666 | -0.256 |
| 0.8548611111111111 | -0.256 |
| 0.8555555555555556 | -0.256 |
| 0.8562500000000001 | -0.256 |
| 0.8569444444444444 | -0.256 |
| 0.8576388888888888 | -0.256 |
| 0.8583333333333334 | -0.256 |
| 0.8590277777777778 | -0.256 |
| 0.8597222222222222 | -0.256 |
| 0.8604166666666666 | -0.256 |
| 0.8611111111111112 | -0.256 |
| 0.8618055555555556 | -0.256 |
| 0.8624999999999999 | -0.256 |
| 0.8631944444444444 | -0.256 |
| 0.8638888888888889 | -0.256 |
| 0.8645833333333334 | -0.256 |
| 0.8652777777777777 | -0.256 |
| 0.8659722222222223 | -0.256 |
| 0.8666666666666667 | -0.256 |
| 0.8673611111111111 | -0.256 |
| 0.8680555555555555 | -0.256 |
| 0.86875 | -0.256 |
| 0.8694444444444445 | -0.256 |
| 0.8701388888888889 | -0.256 |
| 0.8708333333333332 | -0.256 |
| 0.8715277777777778 | -0.256 |
| 0.8722222222222222 | -0.256 |
| 0.8729166666666667 | -0.256 |
| 0.873611111111111 | -0.256 |
| 0.8743055555555556 | -0.256 |
| 0.875 | -0.256 |
| 0.8756944444444444 | -0.256 |
| 0.876388888888889 | -0.256 |
| 0.8770833333333333 | -0.256 |
| 0.8777777777777778 | -0.256 |
| 0.8784722222222222 | -0.256 |
| 0.8791666666666668 | -0.256 |
| 0.8798611111111111 | -0.256 |
| 0.8805555555555555 | -0.256 |
| 0.88125 | -0.256 |
| 0.8819444444444445 | -0.256 |
| 0.8826388888888889 | -0.256 |
| 0.8833333333333333 | -0.256 |
| 0.8840277777777777 | -0.256 |
| 0.8847222222222223 | -0.256 |
| 0.8854166666666666 | -0.256 |
| 0.8861111111111111 | -0.256 |
| 0.8868055555555556 | -0.256 |
| 0.8875000000000001 | -0.256 |
| 0.8881944444444444 | -0.256 |
| 0.8888888888888888 | -0.256 |
| 0.8895833333333334 | -0.256 |
| 0.8902777777777778 | -0.256 |
| 0.8909722222222222 | -0.256 |
| 0.8916666666666666 | -0.256 |
| 0.8923611111111112 | -0.256 |
| 0.8930555555555556 | -0.256 |
| 0.8937499999999999 | -0.256 |
| 0.8944444444444444 | -0.256 |
| 0.8951388888888889 | -0.256 |
| 0.8958333333333334 | -0.256 |
| 0.8965277777777777 | -0.256 |
| 0.8972222222222223 | -0.256 |
| 0.8979166666666667 | -0.256 |
| 0.8986111111111111 | -0.256 |
| 0.8993055555555555 | -0.256 |
| 0.9 | -0.256 |
| 0.9006944444444445 | -0.256 |
| 0.9013888888888889 | -0.256 |
| 0.9020833333333332 | -0.256 |
| 0.9027777777777778 | -0.256 |
| 0.9034722222222222 | -0.256 |
| 0.9041666666666667 | -0.256 |
| 0.904861111111111 | -0.256 |
| 0.9055555555555556 | -0.256 |
| 0.90625 | -0.256 |
| 0.9069444444444444 | -0.256 |
| 0.907638888888889 | -0.256 |
| 0.9083333333333333 | -0.256 |
| 0.9090277777777778 | -0.256 |
| 0.9097222222222222 | -0.256 |
| 0.9104166666666668 | -0.256 |
| 0.9111111111111111 | -0.256 |
| 0.9118055555555555 | -0.256 |
| 0.9125 | -0.256 |
| 0.9131944444444445 | -0.256 |
| 0.9138888888888889 | -0.256 |
| 0.9145833333333333 | -0.256 |
| 0.9152777777777777 | -0.256 |
| 0.9159722222222223 | -0.256 |
| 0.9166666666666666 | -0.256 |
| 0.9173611111111111 | -0.256 |
| 0.9180555555555556 | -0.256 |
| 0.9187500000000001 | -0.256 |
| 0.9194444444444444 | -0.256 |
| 0.9201388888888888 | -0.256 |
| 0.9208333333333334 | -0.256 |
| 0.9215277777777778 | -0.256 |
| 0.9222222222222222 | -0.256 |
| 0.9229166666666666 | -0.256 |
| 0.9236111111111112 | -0.256 |
| 0.9243055555555556 | -0.256 |
| 0.9249999999999999 | -0.256 |
| 0.9256944444444444 | -0.256 |
| 0.9263888888888889 | -0.256 |
| 0.9270833333333334 | -0.256 |
| 0.9277777777777777 | -0.256 |
| 0.9284722222222223 | -0.256 |
| 0.9291666666666667 | -0.256 |
| 0.9298611111111111 | -0.256 |
| 0.9305555555555555 | -0.256 |
| 0.93125 | -0.256 |
| 0.9319444444444445 | -0.256 |
| 0.9326388888888889 | -0.256 |
| 0.9333333333333332 | -0.256 |
| 0.9340277777777778 | -0.256 |
| 0.9347222222222222 | -0.256 |
| 0.9354166666666667 | -0.256 |
| 0.936111111111111 | -0.256 |
| 0.9368055555555556 | -0.256 |
| 0.9375 | -0.256 |
| 0.9381944444444444 | -0.256 |
| 0.938888888888889 | -0.256 |
| 0.9395833333333333 | -0.256 |
| 0.9402777777777778 | -0.256 |
| 0.9409722222222222 | -0.256 |
| 0.9416666666666668 | -0.256 |
| 0.9423611111111111 | -0.256 |
| 0.9430555555555555 | -0.256 |
| 0.94375 | -0.256 |
| 0.9444444444444445 | -0.256 |
| 0.9451388888888889 | -0.256 |
| 0.9458333333333333 | -0.256 |
| 0.9465277777777777 | -0.256 |
| 0.9472222222222223 | -0.256 |
| 0.9479166666666666 | -0.256 |
| 0.9486111111111111 | -0.256 |
| 0.9493055555555556 | -0.256 |
| 0.9500000000000001 | -0.256 |
| 0.9506944444444444 | -0.256 |
| 0.9513888888888888 | -0.256 |
| 0.9520833333333334 | -0.256 |
| 0.9527777777777778 | -0.256 |
| 0.9534722222222222 | -0.256 |
| 0.9541666666666666 | -0.256 |
| 0.9548611111111112 | -0.256 |
| 0.9555555555555556 | -0.256 |
| 0.9562499999999999 | -0.256 |
| 0.9569444444444444 | -0.256 |
| 0.9576388888888889 | -0.256 |
| 0.9583333333333334 | -0.256 |
| 0.9590277777777777 | -0.256 |
| 0.9597222222222223 | -0.256 |
| 0.9604166666666667 | -0.256 |
| 0.9611111111111111 | -0.256 |
| 0.9618055555555555 | -0.256 |
| 0.9625 | -0.256 |
| 0.9631944444444445 | -0.256 |
| 0.9638888888888889 | -0.256 |
| 0.9645833333333332 | -0.256 |
| 0.9652777777777778 | -0.256 |
| 0.9659722222222222 | -0.256 |
| 0.9666666666666667 | -0.256 |
| 0.967361111111111 | -0.256 |
| 0.9680555555555556 | -0.256 |
| 0.96875 | -0.256 |
| 0.9694444444444444 | -0.256 |
| 0.970138888888889 | -0.256 |
| 0.9708333333333333 | -0.256 |
| 0.9715277777777778 | -0.256 |
| 0.9722222222222222 | -0.256 |
| 0.9729166666666668 | -0.256 |
| 0.9736111111111111 | -0.256 |
| 0.9743055555555555 | -0.256 |
| 0.975 | -0.256 |
| 0.9756944444444445 | -0.256 |
| 0.9763888888888889 | -0.256 |
| 0.9770833333333333 | -0.256 |
| 0.9777777777777777 | -0.256 |
| 0.9784722222222223 | -0.256 |
| 0.9791666666666666 | -0.256 |
| 0.9798611111111111 | -0.256 |
| 0.9805555555555556 | -0.256 |
| 0.9812500000000001 | -0.256 |
| 0.9819444444444444 | -0.256 |
| 0.9826388888888888 | -0.256 |
| 0.9833333333333334 | -0.256 |
| 0.9840277777777778 | -0.256 |
| 0.9847222222222222 | -0.256 |
| 0.9854166666666666 | -0.256 |
| 0.9861111111111112 | -0.256 |
| 0.9868055555555556 | -0.256 |
| 0.9874999999999999 | -0.256 |
| 0.9881944444444444 | -0.256 |
| 0.9888888888888889 | -0.256 |
| 0.9895833333333334 | -0.256 |
| 0.9902777777777777 | -0.256 |
| 0.9909722222222223 | -0.256 |
| 0.9916666666666667 | -0.256 |
| 0.9923611111111111 | -0.256 |
| 0.9930555555555555 | -0.256 |
| 0.99375 | -0.256 |
| 0.9944444444444445 | -0.256 |
| 0.9951388888888889 | -0.256 |
| 0.9958333333333332 | -0.256 |
| 0.9965277777777778 | -0.256 |
| 0.9972222222222222 | -0.256 |
| 0.9979166666666667 | -0.256 |
| 0.998611111111111 | -0.256 |
| 0.9993055555555556 | 0 |